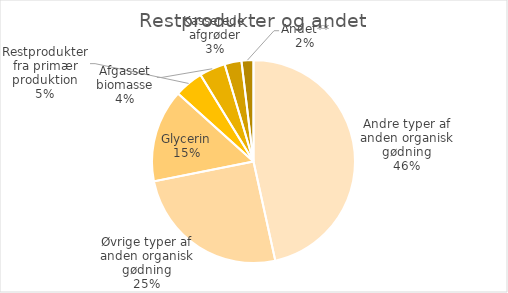
| Category | Series 0 |
|---|---|
| Andre typer af anden organisk gødning | 156799.56 |
| Øvrige typer af anden organisk gødning | 85253 |
| Glycerin | 49835.6 |
| Restprodukter fra primær produktion | 15513.29 |
| Afgasset biomasse | 13962.08 |
| Kasserede afgrøder | 9043.71 |
| Andet** | 6411.6 |